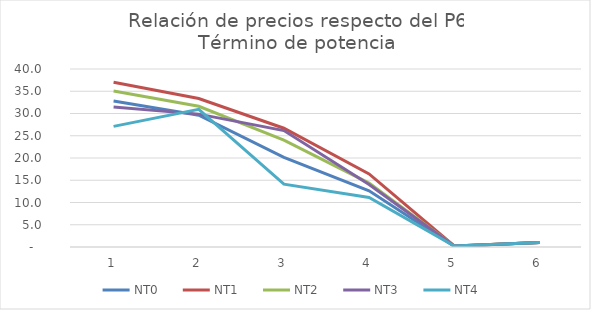
| Category | NT0 | NT1 | NT2 | NT3 | NT4 |
|---|---|---|---|---|---|
| 0 | 32.823 | 37.003 | 35.065 | 31.465 | 27.1 |
| 1 | 29.614 | 33.37 | 31.628 | 29.86 | 30.926 |
| 2 | 20.149 | 26.689 | 24 | 26.166 | 14.112 |
| 3 | 12.636 | 16.411 | 14.358 | 14.041 | 11.113 |
| 4 | 0.173 | 0.226 | 0.213 | 0.206 | 0.219 |
| 5 | 1 | 1 | 1 | 1 | 1 |